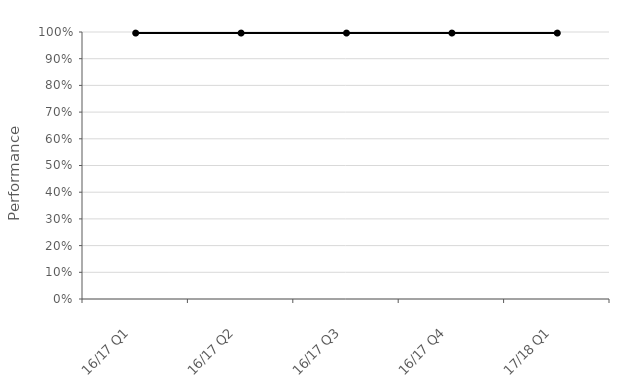
| Category | National |
|---|---|
| 16/17 Q1 | 0.996 |
| 16/17 Q2 | 0.996 |
| 16/17 Q3 | 0.996 |
| 16/17 Q4 | 0.996 |
| 17/18 Q1 | 0.996 |